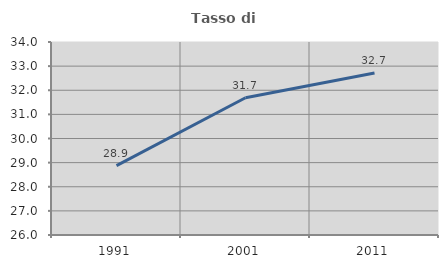
| Category | Tasso di occupazione   |
|---|---|
| 1991.0 | 28.877 |
| 2001.0 | 31.69 |
| 2011.0 | 32.712 |